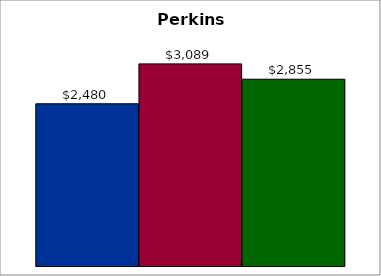
| Category | 50 states and D.C. | SREB states | State |
|---|---|---|---|
| 0 | 2479.532 | 3089.04 | 2854.532 |